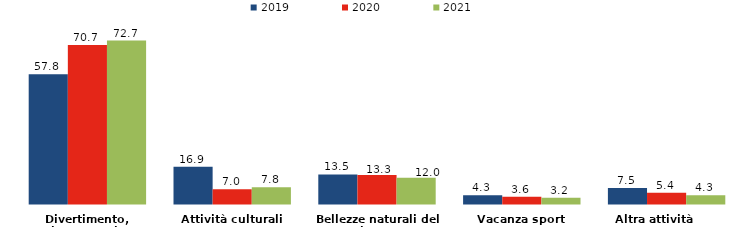
| Category | 2019 | 2020 | 2021 |
|---|---|---|---|
| Divertimento, riposo o relax | 57.8 | 70.7 | 72.7 |
| Attività culturali | 16.9 | 7 | 7.8 |
| Bellezze naturali del luogo | 13.5 | 13.3 | 12 |
| Vacanza sport | 4.3 | 3.6 | 3.2 |
| Altra attività       | 7.5 | 5.4 | 4.3 |